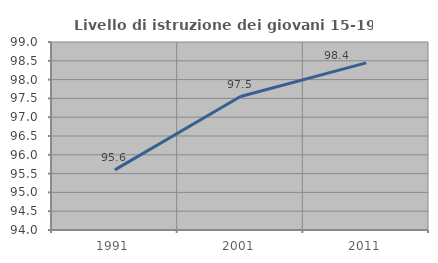
| Category | Livello di istruzione dei giovani 15-19 anni |
|---|---|
| 1991.0 | 95.6 |
| 2001.0 | 97.55 |
| 2011.0 | 98.444 |